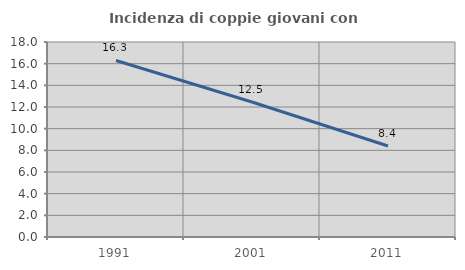
| Category | Incidenza di coppie giovani con figli |
|---|---|
| 1991.0 | 16.293 |
| 2001.0 | 12.458 |
| 2011.0 | 8.398 |